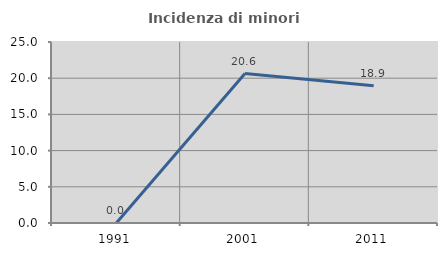
| Category | Incidenza di minori stranieri |
|---|---|
| 1991.0 | 0 |
| 2001.0 | 20.635 |
| 2011.0 | 18.947 |